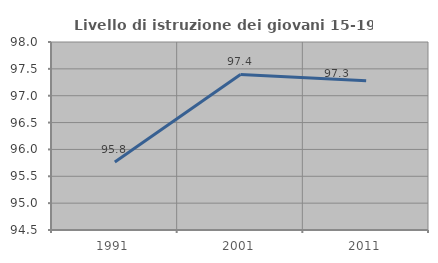
| Category | Livello di istruzione dei giovani 15-19 anni |
|---|---|
| 1991.0 | 95.767 |
| 2001.0 | 97.396 |
| 2011.0 | 97.279 |